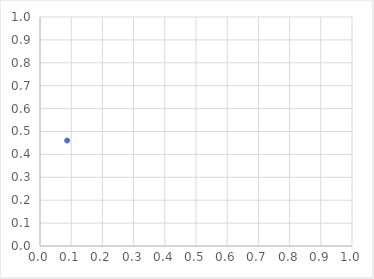
| Category | Series 0 |
|---|---|
| 0.08702398578338821 | 0.461 |